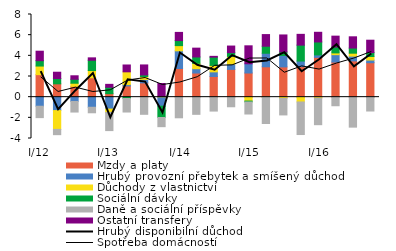
| Category | Mzdy a platy | Hrubý provozní přebytek a smíšený důchod | Důchody z vlastnictví | Sociální dávky  | Daně a sociální příspěvky | Ostatní transfery |
|---|---|---|---|---|---|---|
| I/12 | 2.18 | -0.878 | 0.831 | 0.519 | -1.102 | 0.917 |
| II | 1.291 | -1.297 | -1.821 | 0.51 | -0.51 | 0.612 |
| III | 1.049 | -0.415 | 0.3 | 0.386 | -1.025 | 0.335 |
| IV | 1.879 | -0.977 | 0.698 | 0.994 | -0.534 | 0.233 |
| I/13 | 0.339 | -1.155 | -0.319 | 0.62 | -1.76 | 0.281 |
| II | 1.086 | 0.133 | 1.234 | -0.13 | -1.308 | 0.662 |
| III | 1.383 | 0.336 | 0.283 | 0.152 | -1.658 | 0.965 |
|  IV | 0.034 | -0.874 | 0.048 | -1.095 | -0.887 | 1.24 |
|  I/14 | 2.771 | 1.713 | 0.504 | 0.489 | -1.995 | 0.791 |
| II | 2.338 | 0.418 | 0.516 | 0.619 | -1.661 | 0.853 |
| III | 2.003 | 0.446 | 0.622 | 0.801 | -1.346 | 0.078 |
| IV | 2.689 | 0.515 | 0.744 | 0.361 | -0.929 | 0.639 |
|  I/15 | 2.339 | 0.892 | -0.378 | -0.086 | -1.165 | 1.738 |
| II | 2.94 | 1.309 | -0.032 | 0.681 | -2.52 | 1.126 |
| III | 2.93 | 1.107 | -0.118 | 0.337 | -1.6 | 1.647 |
| IV | 2.961 | 0.535 | -0.467 | 1.54 | -3.15 | 1.043 |
|  I/16 | 3.854 | 0.235 | -0.092 | 1.254 | -2.57 | 0.935 |
| II | 3.396 | 0.715 | 0.172 | 0.572 | -0.83 | 1.05 |
| III | 3.511 | 0.461 | 0.284 | 0.497 | -2.9 | 1.088 |
| IV | 3.334 | 0.258 | 0.344 | 0.379 | -1.34 | 1.198 |